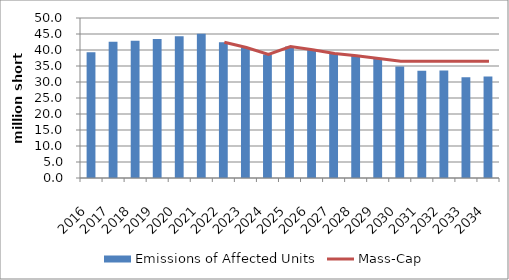
| Category | Emissions of Affected Units |
|---|---|
| 2016.0 | 39.316 |
| 2017.0 | 42.595 |
| 2018.0 | 42.861 |
| 2019.0 | 43.412 |
| 2020.0 | 44.309 |
| 2021.0 | 45.091 |
| 2022.0 | 42.441 |
| 2023.0 | 40.779 |
| 2024.0 | 38.626 |
| 2025.0 | 41.063 |
| 2026.0 | 40.095 |
| 2027.0 | 38.93 |
| 2028.0 | 38.184 |
| 2029.0 | 37.376 |
| 2030.0 | 34.872 |
| 2031.0 | 33.536 |
| 2032.0 | 33.586 |
| 2033.0 | 31.468 |
| 2034.0 | 31.687 |